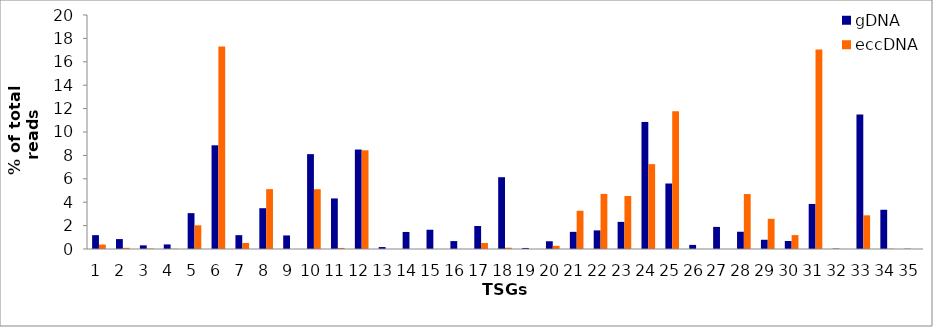
| Category | gDNA | eccDNA |
|---|---|---|
| 0 | 1.184 | 0.381 |
| 1 | 0.848 | 0.101 |
| 2 | 0.311 | 0.042 |
| 3 | 0.391 | 0.021 |
| 4 | 3.065 | 2.025 |
| 5 | 8.863 | 17.3 |
| 6 | 1.182 | 0.511 |
| 7 | 3.487 | 5.118 |
| 8 | 1.158 | 0.001 |
| 9 | 8.108 | 5.109 |
| 10 | 4.322 | 0.091 |
| 11 | 8.502 | 8.436 |
| 12 | 0.167 | 0 |
| 13 | 1.457 | 0 |
| 14 | 1.646 | 0 |
| 15 | 0.677 | 0.005 |
| 16 | 1.967 | 0.511 |
| 17 | 6.137 | 0.108 |
| 18 | 0.089 | 0 |
| 19 | 0.662 | 0.271 |
| 20 | 1.466 | 3.27 |
| 21 | 1.591 | 4.71 |
| 22 | 2.319 | 4.528 |
| 23 | 10.858 | 7.254 |
| 24 | 5.598 | 11.773 |
| 25 | 0.349 | 0 |
| 26 | 1.888 | 0 |
| 27 | 1.476 | 4.697 |
| 28 | 0.791 | 2.579 |
| 29 | 0.686 | 1.188 |
| 30 | 3.852 | 17.058 |
| 31 | 0.032 | 0.005 |
| 32 | 11.498 | 2.877 |
| 33 | 3.354 | 0.027 |
| 34 | 0.021 | 0 |